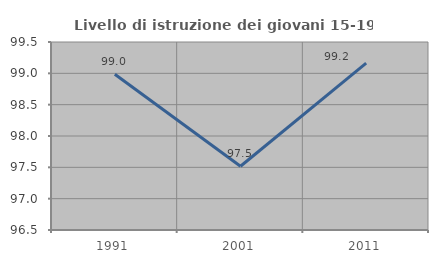
| Category | Livello di istruzione dei giovani 15-19 anni |
|---|---|
| 1991.0 | 98.985 |
| 2001.0 | 97.518 |
| 2011.0 | 99.163 |